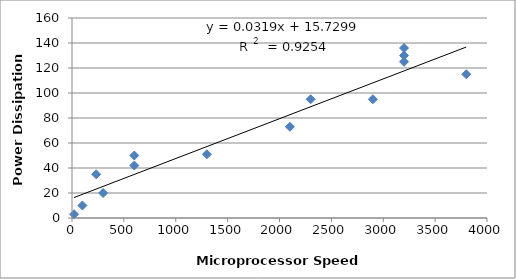
| Category | Series 0 |
|---|---|
| 20.0 | 3 |
| 100.0 | 10 |
| 233.0 | 35 |
| 300.0 | 20 |
| 600.0 | 42 |
| 600.0 | 50 |
| 1300.0 | 51 |
| 2100.0 | 73 |
| 3800.0 | 115 |
| 3200.0 | 130 |
| 2300.0 | 95 |
| 3200.0 | 136 |
| 2900.0 | 95 |
| 3200.0 | 125 |